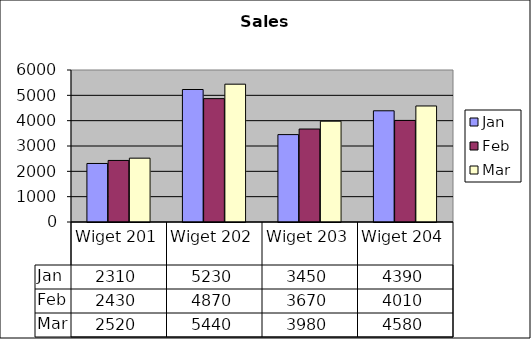
| Category | Jan | Feb | Mar |
|---|---|---|---|
| Wiget 201 | 2310 | 2430 | 2520 |
| Wiget 202 | 5230 | 4870 | 5440 |
| Wiget 203 | 3450 | 3670 | 3980 |
| Wiget 204 | 4390 | 4010 | 4580 |